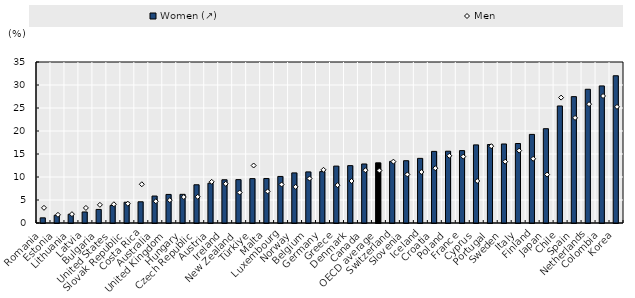
| Category | Women (↗) |
|---|---|
| Romania | 1.12 |
| Estonia | 1.67 |
| Lithuania | 1.9 |
| Latvia | 2.4 |
| Bulgaria | 2.95 |
| United States | 3.82 |
| Slovak Republic | 4.51 |
| Costa Rica | 4.61 |
| Australia | 5.86 |
| United Kingdom | 6.21 |
| Hungary | 6.23 |
| Czech Republic | 8.31 |
| Austria | 8.65 |
| Ireland | 9.4 |
| New Zealand | 9.43 |
| Türkiye | 9.65 |
| Malta | 9.68 |
| Luxembourg | 10.12 |
| Norway | 10.89 |
| Belgium | 11.11 |
| Germany | 11.17 |
| Greece | 12.37 |
| Denmark | 12.47 |
| Canada | 12.83 |
| OECD average | 13.084 |
| Switzerland | 13.4 |
| Slovenia | 13.54 |
| Iceland | 14.05 |
| Croatia | 15.57 |
| Poland | 15.61 |
| France | 15.74 |
| Cyprus | 16.98 |
| Portugal | 17.06 |
| Sweden | 17.18 |
| Italy | 17.28 |
| Finland | 19.26 |
| Japan | 20.5 |
| Chile | 25.44 |
| Spain | 27.47 |
| Netherlands | 29.07 |
| Colombia | 29.8 |
| Korea | 32.01 |